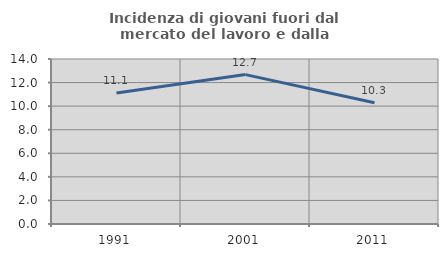
| Category | Incidenza di giovani fuori dal mercato del lavoro e dalla formazione  |
|---|---|
| 1991.0 | 11.111 |
| 2001.0 | 12.676 |
| 2011.0 | 10.294 |